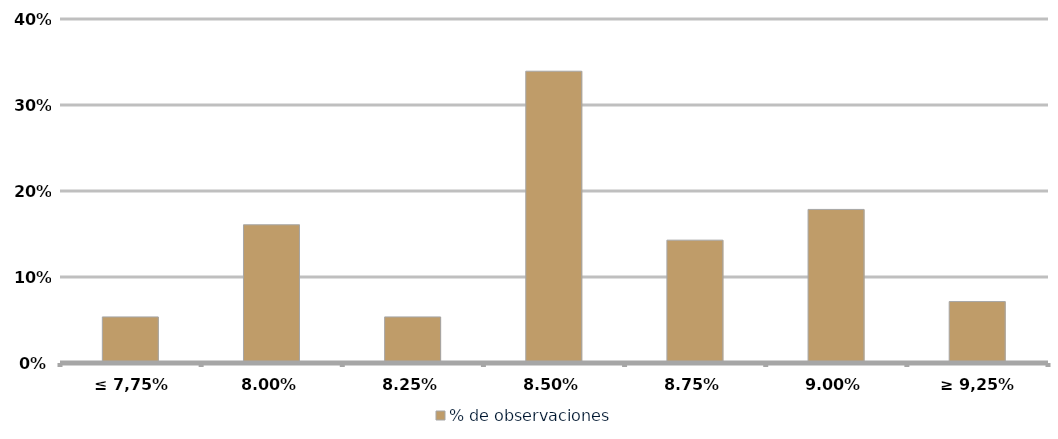
| Category | % de observaciones  |
|---|---|
| ≤ 7,75% | 0.054 |
| 8,00% | 0.161 |
| 8,25% | 0.054 |
| 8,50% | 0.339 |
| 8,75% | 0.143 |
| 9,00% | 0.179 |
| ≥ 9,25% | 0.071 |